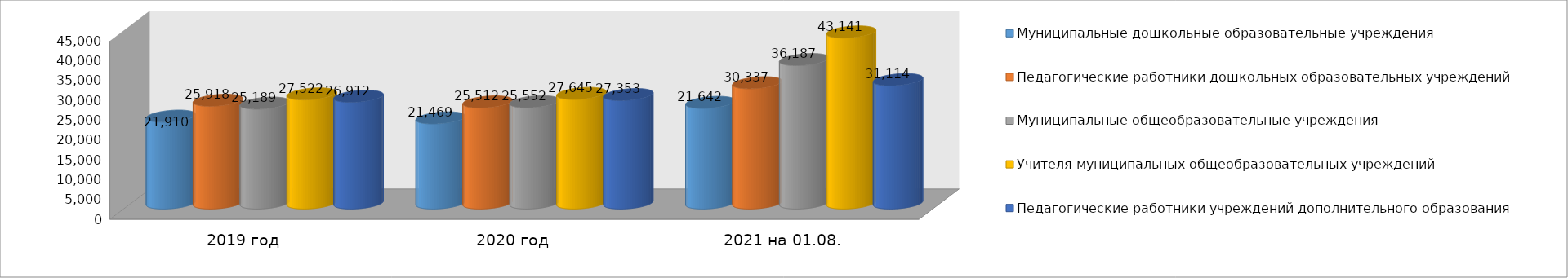
| Category | Муниципальные дошкольные образовательные учреждения | Педагогические работники дошкольных образовательных учреждений | Муниципальные общеобразовательные учреждения | Учителя муниципальных общеобразовательных учреждений | Педагогические работники учреждений дополнительного образования |
|---|---|---|---|---|---|
| 2019 год | 21910 | 25918 | 25189 | 27522 | 26912 |
| 2020 год | 21469 | 25512 | 25552 | 27645 | 27353 |
| 2021 на 01.08. | 25390 | 30337 | 36187 | 43141 | 31114 |